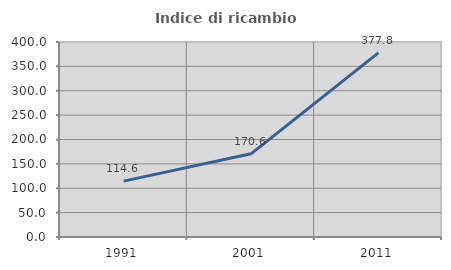
| Category | Indice di ricambio occupazionale  |
|---|---|
| 1991.0 | 114.583 |
| 2001.0 | 170.588 |
| 2011.0 | 377.778 |